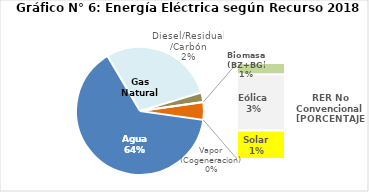
| Category | Series 0 |
|---|---|
| Agua | 3003.682 |
| Gas Natural | 1347.637 |
| Diesel/Residual/Carbón | 112.757 |
| Vapor (Cogeneracion) | 0.375 |
| Biomasa (BZ+BG) | 25.159 |
| Eólica | 121.945 |
| Solar | 62.168 |